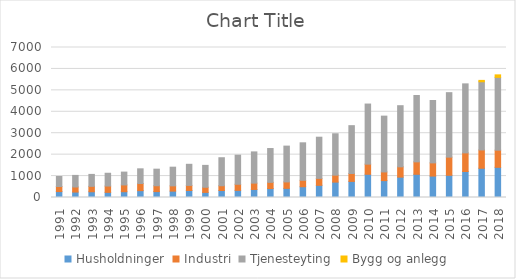
| Category | Husholdninger | Industri | Tjenesteyting | Bygg og anlegg |
|---|---|---|---|---|
| 1991.0 | 276 | 237 | 466 | 0 |
| 1992.0 | 254 | 237 | 540 | 0 |
| 1993.0 | 268 | 253 | 557 | 0 |
| 1994.0 | 240 | 295 | 596 | 0 |
| 1995.0 | 271 | 316 | 598 | 0 |
| 1996.0 | 320 | 333 | 685 | 0 |
| 1997.0 | 276 | 273 | 773 | 0 |
| 1998.0 | 297 | 247 | 871 | 0 |
| 1999.0 | 326 | 238 | 985 | 0 |
| 2000.0 | 238 | 240 | 1021 | 0 |
| 2001.0 | 327 | 222 | 1307 | 0 |
| 2002.0 | 333 | 285 | 1358 | 0 |
| 2003.0 | 375 | 296 | 1457 | 0 |
| 2004.0 | 417 | 290 | 1578 | 0 |
| 2005.0 | 427 | 301 | 1670 | 0 |
| 2006.0 | 502 | 301 | 1749 | 0 |
| 2007.0 | 568 | 324 | 1922 | 0 |
| 2008.0 | 718 | 326 | 1930 | 0 |
| 2009.0 | 751 | 369 | 2232 | 0 |
| 2010.0 | 1084 | 473 | 2804 | 0 |
| 2011.0 | 788 | 405 | 2604 | 0 |
| 2012.0 | 950 | 482 | 2852 | 0 |
| 2013.0 | 1083 | 581 | 3095 | 0 |
| 2014.0 | 1000 | 616 | 2912 | 0 |
| 2015.0 | 1037 | 847 | 3008 | 0 |
| 2016.0 | 1212 | 870 | 3221 | 0 |
| 2017.0 | 1365 | 854 | 3181 | 65 |
| 2018.0 | 1408 | 801 | 3397 | 117 |